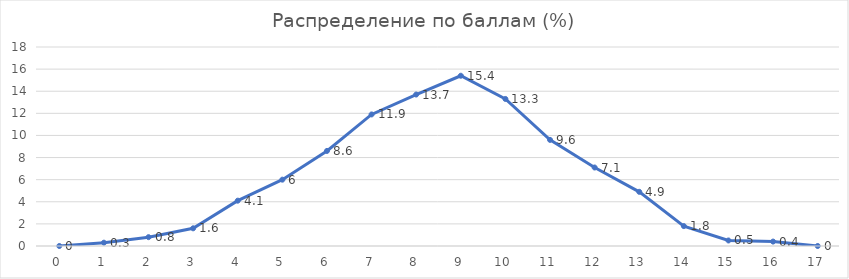
| Category | Series 0 |
|---|---|
| 0.0 | 0 |
| 1.0 | 0.3 |
| 2.0 | 0.8 |
| 3.0 | 1.6 |
| 4.0 | 4.1 |
| 5.0 | 6 |
| 6.0 | 8.6 |
| 7.0 | 11.9 |
| 8.0 | 13.7 |
| 9.0 | 15.4 |
| 10.0 | 13.3 |
| 11.0 | 9.6 |
| 12.0 | 7.1 |
| 13.0 | 4.9 |
| 14.0 | 1.8 |
| 15.0 | 0.5 |
| 16.0 | 0.4 |
| 17.0 | 0 |